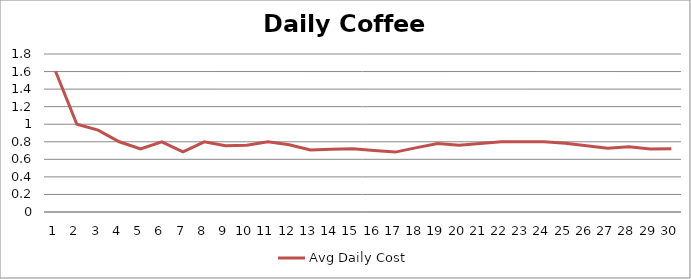
| Category | Avg Daily Cost |
|---|---|
| 0 | 1.6 |
| 1 | 1 |
| 2 | 0.933 |
| 3 | 0.8 |
| 4 | 0.72 |
| 5 | 0.8 |
| 6 | 0.686 |
| 7 | 0.8 |
| 8 | 0.756 |
| 9 | 0.76 |
| 10 | 0.8 |
| 11 | 0.767 |
| 12 | 0.708 |
| 13 | 0.714 |
| 14 | 0.72 |
| 15 | 0.7 |
| 16 | 0.682 |
| 17 | 0.733 |
| 18 | 0.779 |
| 19 | 0.76 |
| 20 | 0.781 |
| 21 | 0.8 |
| 22 | 0.8 |
| 23 | 0.8 |
| 24 | 0.784 |
| 25 | 0.754 |
| 26 | 0.726 |
| 27 | 0.743 |
| 28 | 0.717 |
| 29 | 0.72 |